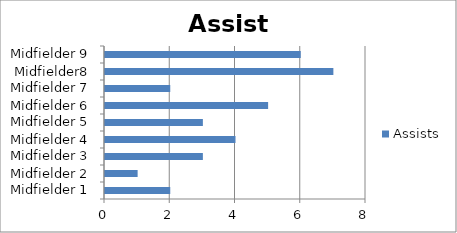
| Category | Assists |
|---|---|
| Midfielder 1 | 2 |
| Midfielder 2 | 1 |
| Midfielder 3 | 3 |
| Midfielder 4 | 4 |
| Midfielder 5 | 3 |
| Midfielder 6 | 5 |
| Midfielder 7 | 2 |
| Midfielder8 | 7 |
| Midfielder 9 | 6 |